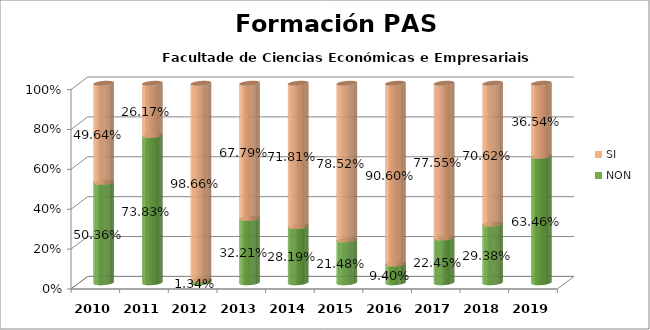
| Category | NON | SI |
|---|---|---|
| 2010.0 | 0.504 | 0.496 |
| 2011.0 | 0.738 | 0.262 |
| 2012.0 | 0.013 | 0.987 |
| 2013.0 | 0.322 | 0.678 |
| 2014.0 | 0.282 | 0.718 |
| 2015.0 | 0.215 | 0.785 |
| 2016.0 | 0.094 | 0.906 |
| 2017.0 | 0.225 | 0.776 |
| 2018.0 | 0.294 | 0.706 |
| 2019.0 | 0.635 | 0.365 |